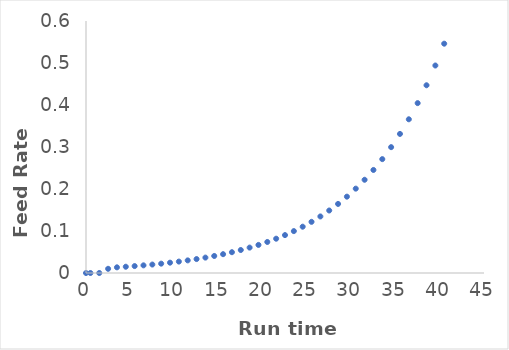
| Category | Series 0 |
|---|---|
| 0.0 | 0 |
| 0.5 | 0 |
| 1.5 | 0 |
| 2.5 | 0.01 |
| 3.5 | 0.013 |
| 4.5 | 0.015 |
| 5.5 | 0.016 |
| 6.5 | 0.018 |
| 7.5 | 0.02 |
| 8.5 | 0.022 |
| 9.5 | 0.025 |
| 10.5 | 0.027 |
| 11.5 | 0.03 |
| 12.5 | 0.033 |
| 13.5 | 0.037 |
| 14.5 | 0.041 |
| 15.5 | 0.045 |
| 16.5 | 0.05 |
| 17.5 | 0.055 |
| 18.5 | 0.06 |
| 19.5 | 0.067 |
| 20.5 | 0.074 |
| 21.5 | 0.082 |
| 22.5 | 0.09 |
| 23.5 | 0.1 |
| 24.5 | 0.11 |
| 25.5 | 0.122 |
| 26.5 | 0.135 |
| 27.5 | 0.149 |
| 28.5 | 0.164 |
| 29.5 | 0.182 |
| 30.5 | 0.201 |
| 31.5 | 0.222 |
| 32.5 | 0.245 |
| 33.5 | 0.271 |
| 34.5 | 0.3 |
| 35.5 | 0.331 |
| 36.5 | 0.366 |
| 37.5 | 0.404 |
| 38.5 | 0.447 |
| 39.5 | 0.494 |
| 40.5 | 0.546 |